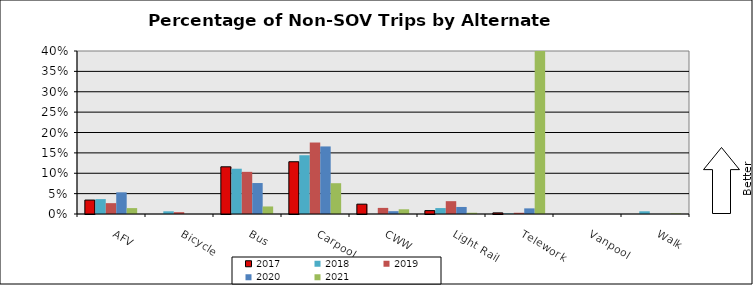
| Category | 2017 | 2018 | 2019 | 2020 | 2021 |
|---|---|---|---|---|---|
| AFV | 0.034 | 0.037 | 0.027 | 0.053 | 0.014 |
| Bicycle | 0 | 0.007 | 0.004 | 0 | 0 |
| Bus | 0.116 | 0.111 | 0.103 | 0.076 | 0.019 |
| Carpool | 0.128 | 0.144 | 0.175 | 0.166 | 0.076 |
| CWW | 0.024 | 0 | 0.015 | 0.007 | 0.012 |
| Light Rail | 0.008 | 0.015 | 0.031 | 0.017 | 0.003 |
| Telework | 0.003 | 0.001 | 0.003 | 0.014 | 0.475 |
| Vanpool | 0 | 0 | 0 | 0 | 0 |
| Walk | 0 | 0.007 | 0 | 0 | 0.002 |